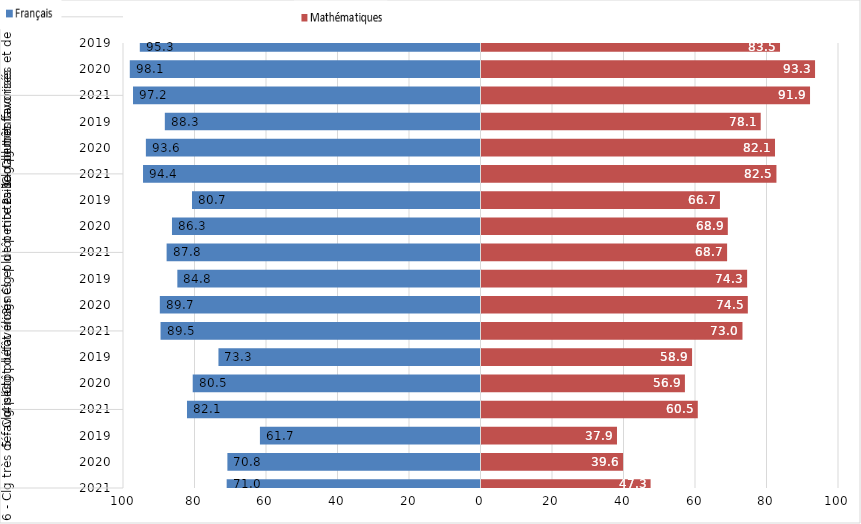
| Category | Français | Mathématiques |
|---|---|---|
| 0 | -71 | 47.3 |
| 1 | -70.8 | 39.6 |
| 2 | -61.7 | 37.9 |
| 3 | -82.1 | 60.5 |
| 4 | -80.5 | 56.9 |
| 5 | -73.3 | 58.9 |
| 6 | -89.5 | 73 |
| 7 | -89.7 | 74.5 |
| 8 | -84.8 | 74.3 |
| 9 | -87.8 | 68.7 |
| 10 | -86.3 | 68.9 |
| 11 | -80.7 | 66.7 |
| 12 | -94.4 | 82.5 |
| 13 | -93.6 | 82.1 |
| 14 | -88.3 | 78.1 |
| 15 | -97.2 | 91.9 |
| 16 | -98.1 | 93.3 |
| 17 | -95.3 | 83.5 |